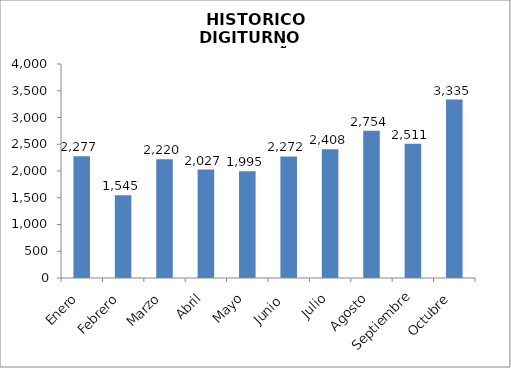
| Category | Series 0 |
|---|---|
| Enero | 2277 |
| Febrero | 1545 |
| Marzo | 2220 |
| Abril  | 2027 |
| Mayo | 1995 |
| Junio  | 2272 |
| Julio | 2408 |
| Agosto | 2754 |
| Septiembre | 2511 |
| Octubre | 3335 |